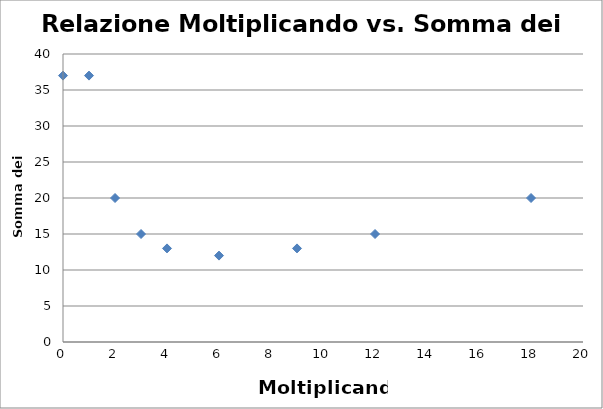
| Category | Series 0 |
|---|---|
| 1.0 | 37 |
| 2.0 | 20 |
| 3.0 | 15 |
| 4.0 | 13 |
| 6.0 | 12 |
| 9.0 | 13 |
| 12.0 | 15 |
| 18.0 | 20 |